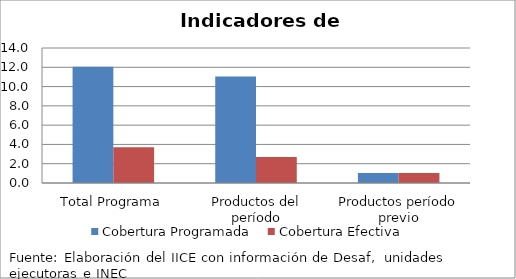
| Category | Cobertura Programada | Cobertura Efectiva |
|---|---|---|
| Total Programa | 12.065 | 3.712 |
| Productos del período | 11.039 | 2.686 |
| Productos período previo | 1.026 | 1.026 |